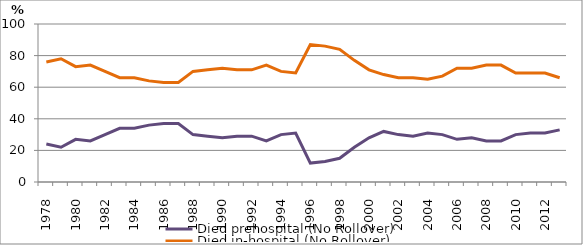
| Category | Died prehospital (No Rollover) | Died in-hospital (No Rollover) |
|---|---|---|
| 1978.0 | 24 | 76 |
| 1979.0 | 22 | 78 |
| 1980.0 | 27 | 73 |
| 1981.0 | 26 | 74 |
| 1982.0 | 30 | 70 |
| 1983.0 | 34 | 66 |
| 1984.0 | 34 | 66 |
| 1985.0 | 36 | 64 |
| 1986.0 | 37 | 63 |
| 1987.0 | 37 | 63 |
| 1988.0 | 30 | 70 |
| 1989.0 | 29 | 71 |
| 1990.0 | 28 | 72 |
| 1991.0 | 29 | 71 |
| 1992.0 | 29 | 71 |
| 1993.0 | 26 | 74 |
| 1994.0 | 30 | 70 |
| 1995.0 | 31 | 69 |
| 1996.0 | 12 | 87 |
| 1997.0 | 13 | 86 |
| 1998.0 | 15 | 84 |
| 1999.0 | 22 | 77 |
| 2000.0 | 28 | 71 |
| 2001.0 | 32 | 68 |
| 2002.0 | 30 | 66 |
| 2003.0 | 29 | 66 |
| 2004.0 | 31 | 65 |
| 2005.0 | 30 | 67 |
| 2006.0 | 27 | 72 |
| 2007.0 | 28 | 72 |
| 2008.0 | 26 | 74 |
| 2009.0 | 26 | 74 |
| 2010.0 | 30 | 69 |
| 2011.0 | 31 | 69 |
| 2012.0 | 31 | 69 |
| 2013.0 | 33 | 66 |